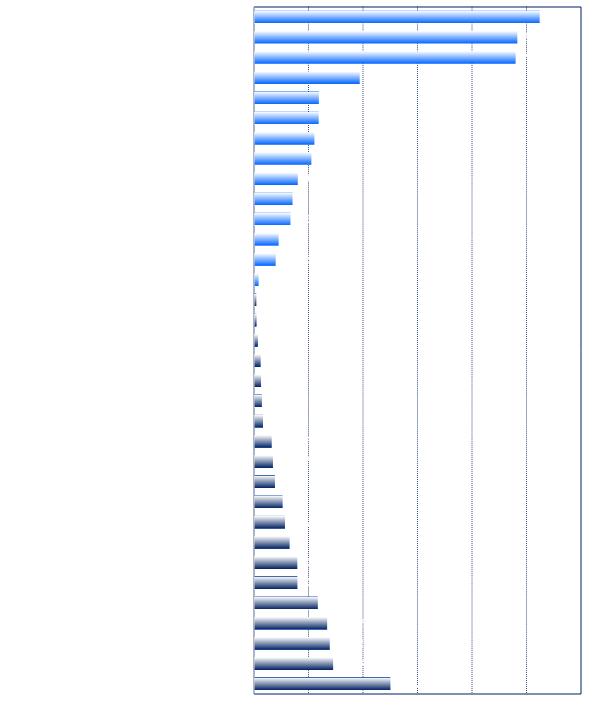
| Category | Series 0 | Series 1 |
|---|---|---|
| Silver (Globex), May 17 | 0.026 | 0 |
| Gold (Globex), Apr 17 | 0.024 | 0 |
| Platinum (Globex), Apr 17 | 0.024 | 0 |
| Euro STOXX 50, Jun 17 | 0.01 | 0 |
| Mexican Peso (Globex), Jun 17 | 0.006 | 0 |
| British Pound (Globex), Jun 17 | 0.006 | 0 |
| DAX Index, Mar 17 | 0.005 | 0 |
| Swiss Franc (Globex), Jun 17 | 0.005 | 0 |
| FTSE 100 - Stnd Index, Mar 17 | 0.004 | 0 |
| Japanese Yen (Globex), Jun 17 | 0.003 | 0 |
| Euro FX (Globex), Jun 17 | 0.003 | 0 |
| Russell 2000 Index Mini, Jun 17 | 0.002 | 0 |
| CAC40, Mar 17 | 0.002 | 0 |
| Canadian Dollar (Globex), Jun 17 | 0 | 0 |
| E-mini MidCap 400, Jun 17 | 0 | 0 |
| 5 Year US Treasury Notes (Globex), Jun 17 | 0 | 0 |
| Nikkei 225 (Globex), Jun 17 | 0 | 0 |
| 10yr US Treasury Notes (Globex), Jun 17 | 0.001 | 0.001 |
| E-mini NASDAQ-100, Jun 17 | 0.001 | 0.001 |
| E-mini Dow ($5), Jun 17 | 0.001 | 0.001 |
| E-Mini S&P 500, Jun 17 | 0.001 | 0.001 |
| Euro BOBL (5yr), Jun 17 | 0.002 | 0.002 |
| RBOB Gasoline (Globex), Apr 17 | 0.002 | 0.002 |
| Australian Dollar (Globex), Jun 17 | 0.002 | 0.002 |
| Euro/British Pound (Globex), Jun 17 | 0.003 | 0.003 |
| Euro Bund (10yr), Jun 17 | 0.003 | 0.003 |
| 30yr US Treasury Bonds (Globex), Jun 17 | 0.003 | 0.003 |
| Long Gilt (CONNECT), Jun 17 | 0.004 | 0.004 |
| Dollar Index (ICE), Jun 17 | 0.004 | 0.004 |
| NY Harbor ULSD, Apr 17 | 0.006 | 0.006 |
| Euro Buxl (30yr), Jun 17 | 0.007 | 0.007 |
| New Zealand Dollar (Globex), Jun 17 | 0.007 | 0.007 |
| Crude Light (Globex), Apr 17 | 0.007 | 0.007 |
| Natural Gas (Globex), Apr 17 | 0.012 | 0.012 |